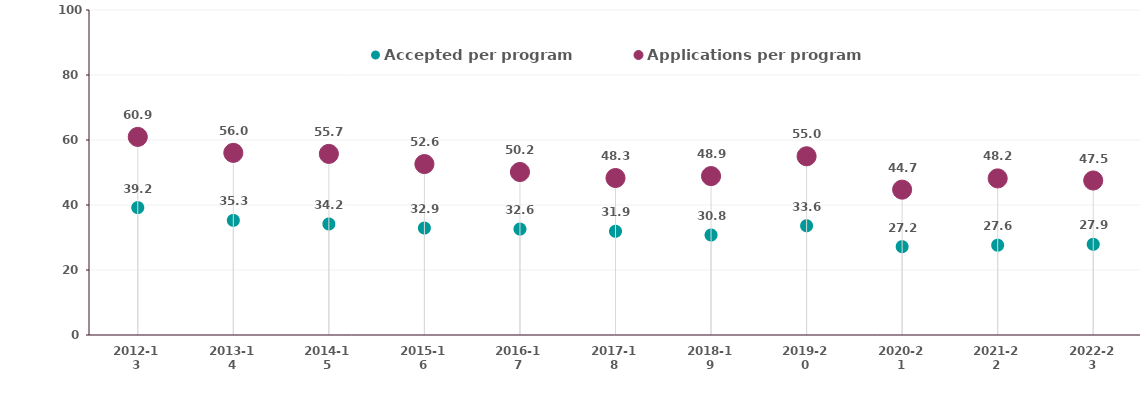
| Category | Accepted per program | Applications per program |
|---|---|---|
| 2012-13 | 39.198 | 60.95 |
| 2013-14 | 35.275 | 56.044 |
| 2014-15 | 34.154 | 55.724 |
| 2015-16 | 32.909 | 52.597 |
| 2016-17 | 32.599 | 50.152 |
| 2017-18 | 31.913 | 48.304 |
| 2018-19 | 30.764 | 48.894 |
| 2019-20 | 33.612 | 54.992 |
| 2020-21 | 27.183 | 44.725 |
| 2021-22 | 27.63 | 48.183 |
| 2022-23 | 27.906 | 47.538 |